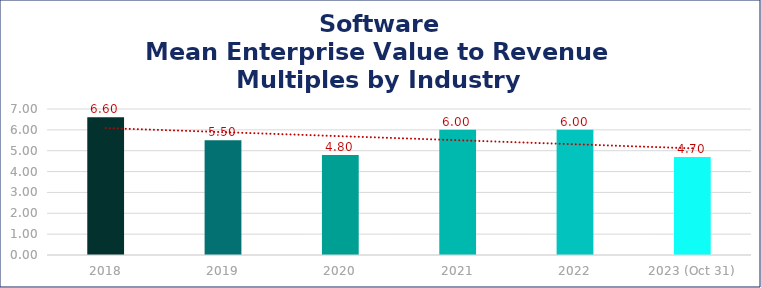
| Category | Software |
|---|---|
| 2018 | 6.6 |
| 2019 | 5.5 |
| 2020 | 4.8 |
| 2021 | 6 |
| 2022 | 6 |
| 2023 (Oct 31) | 4.7 |